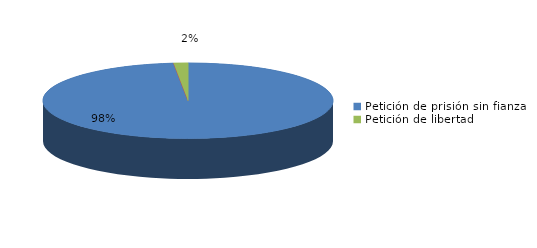
| Category | Series 0 |
|---|---|
| Petición de prisión sin fianza | 124 |
| Peticion de libertad con fianza | 0 |
| Petición de libertad | 2 |